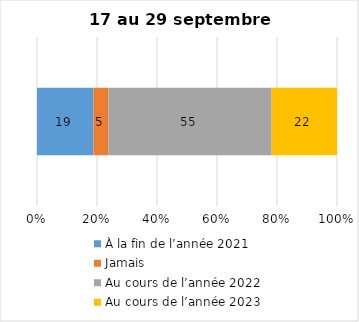
| Category | À la fin de l’année 2021 | Jamais | Au cours de l’année 2022 | Au cours de l’année 2023 |
|---|---|---|---|---|
| 0 | 19 | 5 | 55 | 22 |